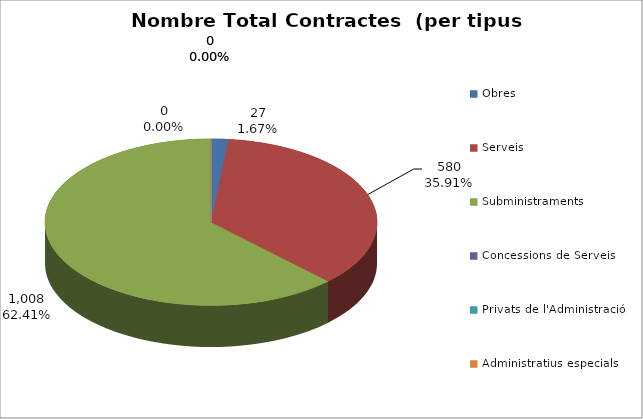
| Category | Nombre Total Contractes |
|---|---|
| Obres | 27 |
| Serveis | 580 |
| Subministraments | 1008 |
| Concessions de Serveis | 0 |
| Privats de l'Administració | 0 |
| Administratius especials | 0 |